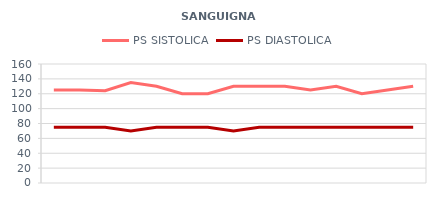
| Category | PS SISTOLICA | PS DIASTOLICA |
|---|---|---|
| 2012-06-01 | 125 | 75 |
| 2012-06-02 | 125 | 75 |
| 2012-06-03 | 124 | 75 |
| 2012-06-04 | 135 | 70 |
| 2012-06-05 | 130 | 75 |
| 2012-06-06 | 120 | 75 |
| 2012-06-07 | 120 | 75 |
| 2012-06-08 | 130 | 70 |
| 2012-06-09 | 130 | 75 |
| 2012-06-10 | 130 | 75 |
| 2012-06-11 | 125 | 75 |
| 2012-06-12 | 130 | 75 |
| 2012-06-13 | 120 | 75 |
| 2012-06-14 | 125 | 75 |
| 2012-06-15 | 130 | 75 |